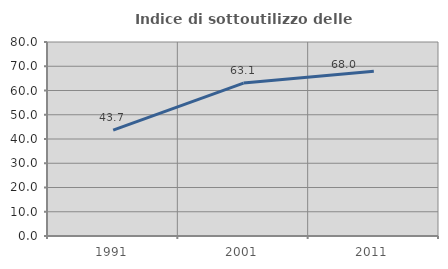
| Category | Indice di sottoutilizzo delle abitazioni  |
|---|---|
| 1991.0 | 43.684 |
| 2001.0 | 63.077 |
| 2011.0 | 67.956 |